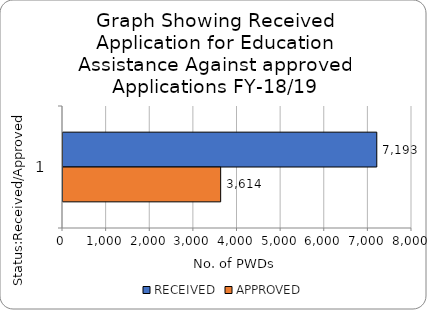
| Category | RECEIVED | APPROVED |
|---|---|---|
| 0 | 7193 | 3614 |